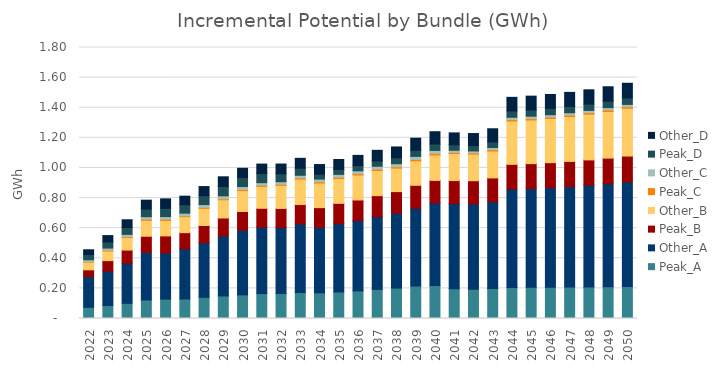
| Category | Peak_A | Other_A | Peak_B | Other_B | Peak_C | Other_C | Peak_D | Other_D |
|---|---|---|---|---|---|---|---|---|
| 2022.0 | 0.074 | 0.204 | 0.045 | 0.051 | 0.003 | 0.013 | 0.035 | 0.032 |
| 2023.0 | 0.086 | 0.228 | 0.07 | 0.064 | 0.005 | 0.014 | 0.041 | 0.042 |
| 2024.0 | 0.101 | 0.266 | 0.088 | 0.083 | 0.006 | 0.015 | 0.045 | 0.052 |
| 2025.0 | 0.123 | 0.315 | 0.108 | 0.106 | 0.007 | 0.017 | 0.051 | 0.059 |
| 2026.0 | 0.128 | 0.306 | 0.114 | 0.103 | 0.008 | 0.018 | 0.055 | 0.063 |
| 2027.0 | 0.129 | 0.333 | 0.108 | 0.106 | 0.006 | 0.018 | 0.056 | 0.057 |
| 2028.0 | 0.141 | 0.362 | 0.116 | 0.114 | 0.006 | 0.019 | 0.059 | 0.06 |
| 2029.0 | 0.15 | 0.398 | 0.12 | 0.121 | 0.007 | 0.02 | 0.062 | 0.064 |
| 2030.0 | 0.157 | 0.429 | 0.124 | 0.138 | 0.007 | 0.02 | 0.06 | 0.061 |
| 2031.0 | 0.165 | 0.441 | 0.126 | 0.145 | 0.007 | 0.018 | 0.061 | 0.063 |
| 2032.0 | 0.166 | 0.437 | 0.127 | 0.153 | 0.008 | 0.017 | 0.053 | 0.065 |
| 2033.0 | 0.172 | 0.456 | 0.128 | 0.169 | 0.008 | 0.018 | 0.047 | 0.066 |
| 2034.0 | 0.17 | 0.435 | 0.131 | 0.163 | 0.008 | 0.018 | 0.033 | 0.064 |
| 2035.0 | 0.176 | 0.453 | 0.135 | 0.164 | 0.008 | 0.02 | 0.033 | 0.066 |
| 2036.0 | 0.183 | 0.466 | 0.138 | 0.166 | 0.008 | 0.02 | 0.034 | 0.068 |
| 2037.0 | 0.193 | 0.483 | 0.14 | 0.167 | 0.008 | 0.02 | 0.036 | 0.07 |
| 2038.0 | 0.202 | 0.498 | 0.143 | 0.156 | 0.009 | 0.02 | 0.039 | 0.072 |
| 2039.0 | 0.216 | 0.517 | 0.153 | 0.163 | 0.009 | 0.021 | 0.041 | 0.08 |
| 2040.0 | 0.219 | 0.549 | 0.15 | 0.169 | 0.009 | 0.021 | 0.043 | 0.082 |
| 2041.0 | 0.197 | 0.567 | 0.153 | 0.18 | 0.007 | 0.014 | 0.037 | 0.079 |
| 2042.0 | 0.194 | 0.567 | 0.154 | 0.177 | 0.007 | 0.014 | 0.035 | 0.08 |
| 2043.0 | 0.199 | 0.577 | 0.158 | 0.178 | 0.009 | 0.015 | 0.037 | 0.087 |
| 2044.0 | 0.206 | 0.653 | 0.165 | 0.288 | 0.009 | 0.016 | 0.042 | 0.091 |
| 2045.0 | 0.207 | 0.656 | 0.166 | 0.29 | 0.009 | 0.016 | 0.042 | 0.091 |
| 2046.0 | 0.208 | 0.661 | 0.166 | 0.293 | 0.009 | 0.016 | 0.042 | 0.092 |
| 2047.0 | 0.209 | 0.667 | 0.167 | 0.298 | 0.01 | 0.016 | 0.042 | 0.093 |
| 2048.0 | 0.21 | 0.675 | 0.169 | 0.303 | 0.01 | 0.016 | 0.043 | 0.094 |
| 2049.0 | 0.211 | 0.684 | 0.17 | 0.31 | 0.01 | 0.016 | 0.043 | 0.096 |
| 2050.0 | 0.213 | 0.694 | 0.172 | 0.318 | 0.01 | 0.016 | 0.043 | 0.097 |